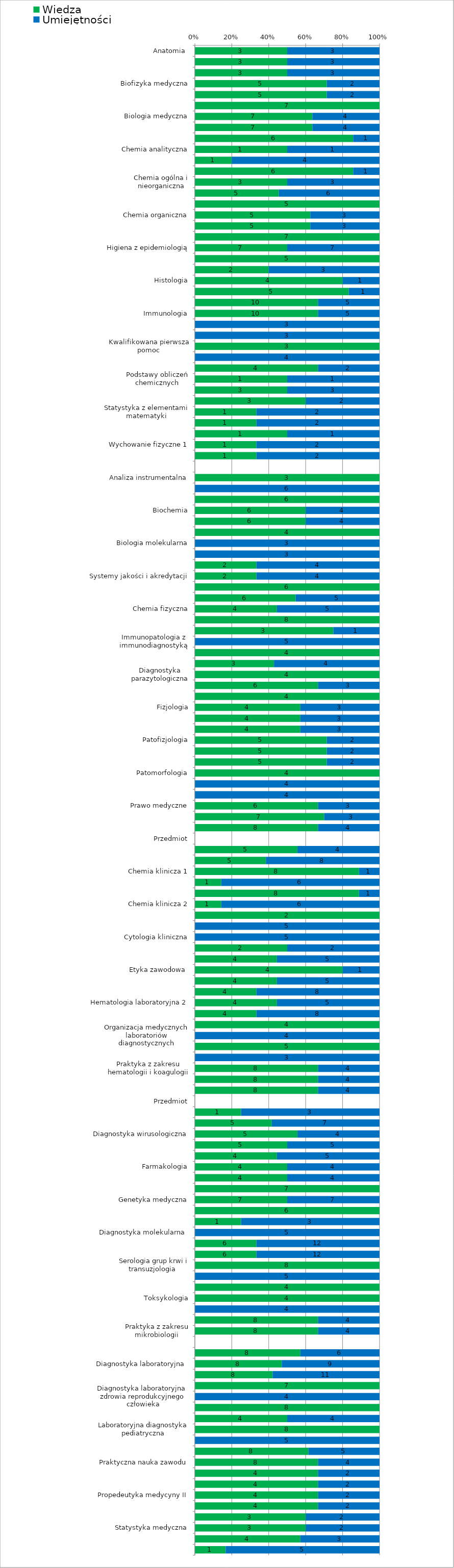
| Category | Wiedza | Umiejętności |
|---|---|---|
| Anatomia  | 3 | 3 |
| Anatomia  | 3 | 3 |
| Anatomia  | 3 | 3 |
| Biofizyka medyczna | 5 | 2 |
| Biofizyka medyczna | 5 | 2 |
| Biologia medyczna  | 7 | 0 |
| Biologia medyczna | 7 | 4 |
| Biologia medyczna | 7 | 4 |
| Chemia analityczna | 6 | 1 |
| Chemia analityczna | 1 | 1 |
| Chemia analityczna | 1 | 4 |
| Chemia ogólna i nieorganiczna | 6 | 1 |
| Chemia ogólna i nieorganiczna | 3 | 3 |
| Chemia ogólna i nieorganiczna | 5 | 6 |
| Chemia organiczna | 5 | 0 |
| Chemia organiczna | 5 | 3 |
| Chemia organiczna | 5 | 3 |
| Higiena z epidemiologią | 7 | 0 |
| Higiena z epidemiologią | 7 | 7 |
| Histologia | 5 | 0 |
| Histologia | 2 | 3 |
| Histologia | 4 | 1 |
| Historia medycyny i analityki medycznej | 5 | 1 |
| Immunologia | 10 | 5 |
| Immunologia | 10 | 5 |
| Język angielski dla diagnostów laboratoryjnych 1 | 0 | 3 |
| Język angielski dla diagnostów laboratoryjnych 2 | 0 | 3 |
| Kwalifikowana pierwsza pomoc | 3 | 0 |
| Kwalifikowana pierwsza pomoc | 0 | 4 |
| Medycyna laboratoryjna w systemie ochrony zdrowia | 4 | 2 |
| Podstawy obliczeń chemicznych | 1 | 1 |
| Psychologia | 3 | 3 |
| Socjologia | 3 | 2 |
| Statystyka z elementami matematyki | 1 | 2 |
| Statystyka z elementami matematyki | 1 | 2 |
| Technologia informacyjna | 1 | 1 |
| Wychowanie fizyczne 1 | 1 | 2 |
| Wychowanie fizyczne 2 | 1 | 2 |
| Przedmiot | 0 | 0 |
| Analiza instrumentalna | 3 | 0 |
| Analiza instrumentalna | 0 | 6 |
| Biochemia | 6 | 0 |
| Biochemia | 6 | 4 |
| Biochemia | 6 | 4 |
| Biologia molekularna | 4 | 0 |
| Biologia molekularna | 0 | 3 |
| Biologia molekularna | 0 | 3 |
| Systemy jakości i akredytacji | 2 | 4 |
| Systemy jakości i akredytacji | 2 | 4 |
| Chemia fizyczna | 6 | 0 |
| Chemia fizyczna | 6 | 5 |
| Chemia fizyczna | 4 | 5 |
| Immunopatologia z immunodiagnostyką | 8 | 0 |
| Immunopatologia z immunodiagnostyką | 3 | 1 |
| Immunopatologia z immunodiagnostyką | 0 | 5 |
| Diagnostyka izotopowa | 4 | 0 |
| Diagnostyka izotopowa | 3 | 4 |
| Diagnostyka parazytologiczna | 4 | 0 |
| Diagnostyka parazytologiczna | 6 | 3 |
| Fizjologia | 4 | 0 |
| Fizjologia | 4 | 3 |
| Fizjologia | 4 | 3 |
| Fizjologia | 4 | 3 |
| Patofizjologia | 5 | 2 |
| Patofizjologia | 5 | 2 |
| Patofizjologia | 5 | 2 |
| Patomorfologia | 4 | 0 |
| Patomorfologia | 0 | 4 |
| Patomorfologia | 0 | 4 |
| Prawo medyczne | 6 | 3 |
| Praktyka zawodowa w zakresie organizacji i systemów jakości w laboratorium | 7 | 3 |
| Praktyka zawodowa w zakresie diagnostyki parazytologicznej | 8 | 4 |
| Przedmiot | 0 | 0 |
| Analityka ogólna | 5 | 4 |
| Analityka ogólna | 5 | 8 |
| Chemia klinicza 1 | 8 | 1 |
| Chemia klinicza 1 | 1 | 6 |
| Chemia klinicza 2 | 8 | 1 |
| Chemia klinicza 2 | 1 | 6 |
| Cytologia kliniczna | 2 | 0 |
| Cytologia kliniczna | 0 | 5 |
| Cytologia kliniczna | 0 | 5 |
| Diagnostyka mikrobiologiczna | 2 | 2 |
| Diagnostyka mikrobiologiczna | 4 | 5 |
| Etyka zawodowa  | 4 | 1 |
| Hematologia laboratoryjna 1 | 4 | 5 |
| Hematologia laboratoryjna 1 | 4 | 8 |
| Hematologia laboratoryjna 2 | 4 | 5 |
| Hematologia laboratoryjna 2 | 4 | 8 |
| Organizacja medycznych laboratoriów diagnostycznych | 4 | 0 |
| Organizacja medycznych laboratoriów diagnostycznych | 0 | 4 |
| Techniki pobierania materiału | 5 | 0 |
| Techniki pobierania materiału | 0 | 3 |
| Praktyka z zakresu hematologii i koagulogii | 8 | 4 |
| Praktyka z zakresuchemii klinicznej | 8 | 4 |
| Praktyka z zakresu analityki ogólnej | 8 | 4 |
| Przedmiot | 0 | 0 |
| Diagnostyka mikrobiologiczna | 1 | 3 |
| Diagnostyka mikrobiologiczna | 5 | 7 |
| Diagnostyka wirusologiczna | 5 | 4 |
| Biochemia kliniczna | 5 | 5 |
| Biochemia kliniczna | 4 | 5 |
| Farmakologia | 4 | 4 |
| Farmakologia | 4 | 4 |
| Genetyka medyczna | 7 | 0 |
| Genetyka medyczna | 7 | 7 |
| Diagnostyka molekularna  | 6 | 0 |
| Diagnostyka molekularna  | 1 | 3 |
| Diagnostyka molekularna  | 0 | 5 |
| Praktyczna nauka zawodu 1 | 6 | 12 |
| Praktyczna nauka zawodu 2 | 6 | 12 |
| Serologia grup krwi i transuzjologia  | 8 | 0 |
| Serologia grup krwi i transuzjologia  | 0 | 5 |
| Toksykologia | 4 | 0 |
| Toksykologia | 4 | 0 |
| Toksykologia | 0 | 4 |
| Praktyka z zakresu serologii grup krwi i transfuzjologii | 8 | 4 |
| Praktyka z zakresu mikrobiologii | 8 | 4 |
| Przedmiot | 0 | 0 |
| Diagnostyka laboratoryjna  | 8 | 6 |
| Diagnostyka laboratoryjna  | 8 | 9 |
| Diagnostyka laboratoryjna  | 8 | 11 |
| Diagnostyka laboratoryjna  zdrowia reprodukcyjnego człowieka | 7 | 0 |
| Diagnostyka laboratoryjna  zdrowia reprodukcyjnego człowieka | 0 | 4 |
| Laboratoryjna diagnostyka wieku starczego | 8 | 0 |
| Laboratoryjna diagnostyka wieku starczego | 4 | 4 |
| Laboratoryjna diagnostyka pediatryczna | 8 | 0 |
| Laboratoryjna diagnostyka pediatryczna | 0 | 5 |
| Podstawy biobankowania | 8 | 5 |
| Praktyczna nauka zawodu | 8 | 4 |
| Propedeutyka medycyny I 1 | 4 | 2 |
| Propedeutyka medycyny I 2 | 4 | 2 |
| Propedeutyka medycyny II | 4 | 2 |
| Propedeutyka medycyny II | 4 | 2 |
| Statystyka medyczna | 3 | 2 |
| Statystyka medyczna | 3 | 2 |
| Diagnostyczna opieka medyczna | 4 | 3 |
| Metodologia badań naukowych - ćwiczenia specjalistyczne | 1 | 5 |